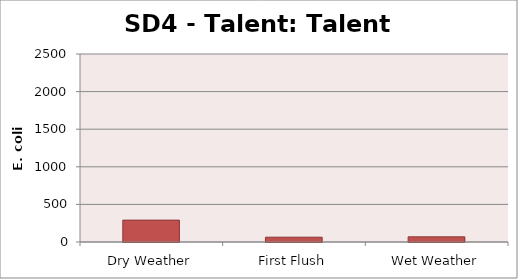
| Category | E. coli MPN |
|---|---|
| Dry Weather | 290.9 |
| First Flush | 63.8 |
| Wet Weather | 68.9 |